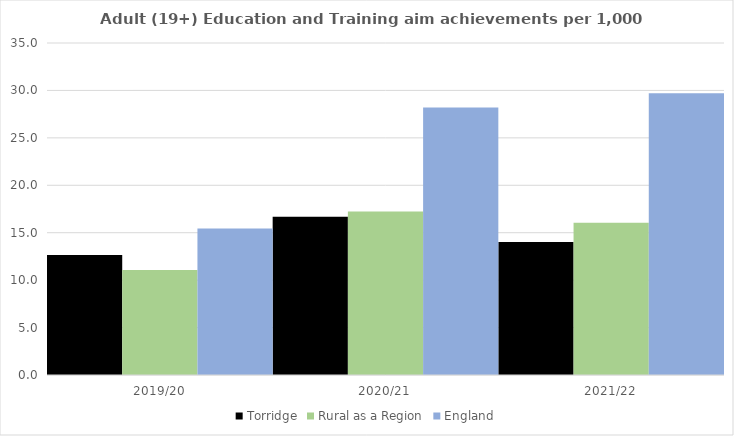
| Category | Torridge | Rural as a Region | England |
|---|---|---|---|
| 2019/20 | 12.657 | 11.081 | 15.446 |
| 2020/21 | 16.683 | 17.224 | 28.211 |
| 2021/22 | 14.027 | 16.063 | 29.711 |